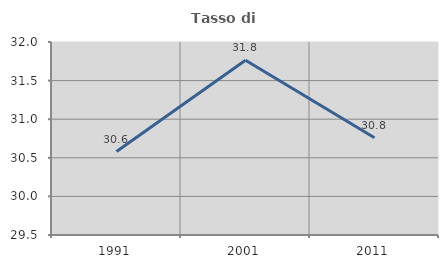
| Category | Tasso di occupazione   |
|---|---|
| 1991.0 | 30.581 |
| 2001.0 | 31.763 |
| 2011.0 | 30.759 |